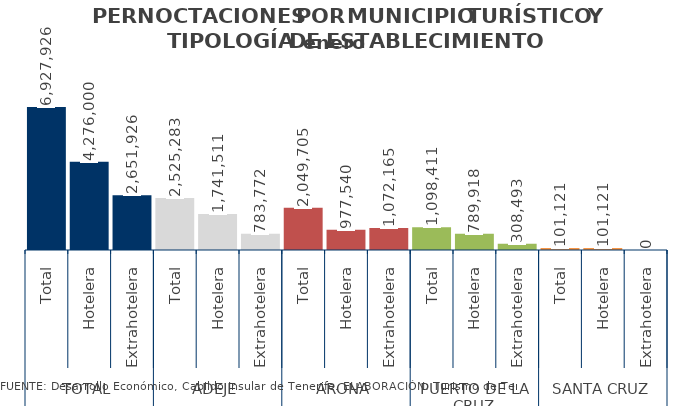
| Category | acum. febrero 2014 |
|---|---|
| 0 | 6927926 |
| 1 | 4276000 |
| 2 | 2651926 |
| 3 | 2525283 |
| 4 | 1741511 |
| 5 | 783772 |
| 6 | 2049705 |
| 7 | 977540 |
| 8 | 1072165 |
| 9 | 1098411 |
| 10 | 789918 |
| 11 | 308493 |
| 12 | 101121 |
| 13 | 101121 |
| 14 | 0 |